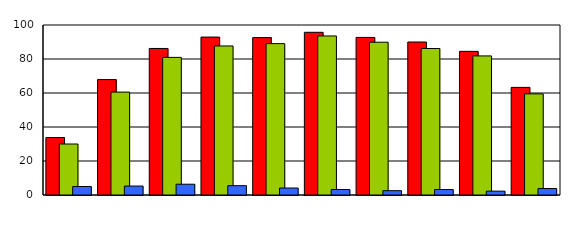
| Category | Series 0 | Series 1 | Series 2 |
|---|---|---|---|
| 0 | 33.8 | 30 | 5 |
| 1 | 67.9 | 60.526 | 5.263 |
| 2 | 86.2 | 80.952 | 6.349 |
| 3 | 92.9 | 87.671 | 5.479 |
| 4 | 92.6 | 89.041 | 4.11 |
| 5 | 95.7 | 93.548 | 3.226 |
| 6 | 92.7 | 89.873 | 2.532 |
| 7 | 90 | 86.17 | 3.191 |
| 8 | 84.5 | 81.818 | 2.273 |
| 9 | 63.3 | 59.494 | 3.797 |